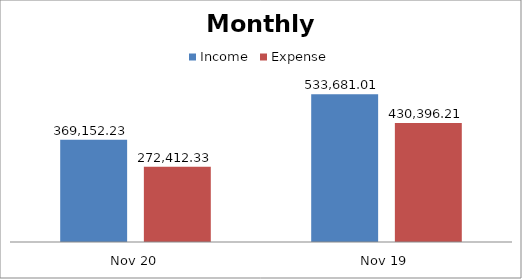
| Category | Income | Expense |
|---|---|---|
| Nov 20 | 369152.23 | 272412.33 |
| Nov 19 | 533681.01 | 430396.21 |